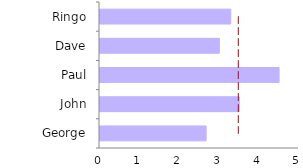
| Category | Series 0 | Series 1 |
|---|---|---|
| Ringo | 3.286 | 3.5 |
| Dave | 3 | 3.5 |
|  Paul | 4.5 | 3.5 |
| John | 3.5 | 3.5 |
| George | 2.667 | 3.5 |